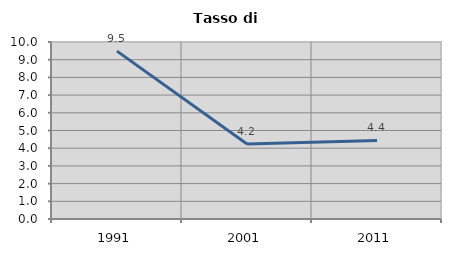
| Category | Tasso di disoccupazione   |
|---|---|
| 1991.0 | 9.484 |
| 2001.0 | 4.235 |
| 2011.0 | 4.439 |